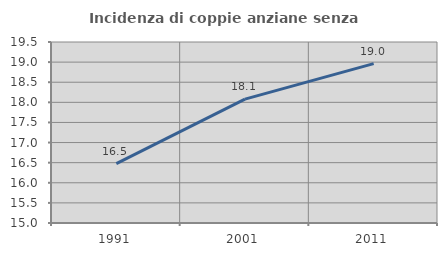
| Category | Incidenza di coppie anziane senza figli  |
|---|---|
| 1991.0 | 16.477 |
| 2001.0 | 18.079 |
| 2011.0 | 18.962 |